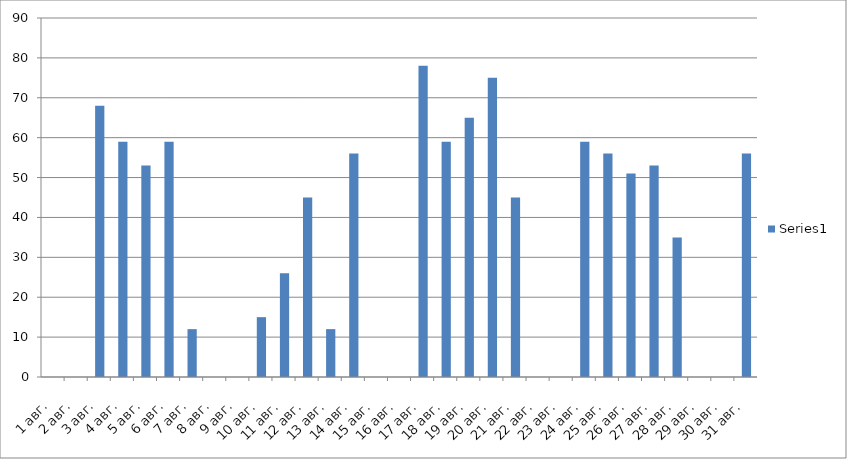
| Category | Series 0 |
|---|---|
| 2020-08-01 | 0 |
| 2020-08-02 | 0 |
| 2020-08-03 | 68 |
| 2020-08-04 | 59 |
| 2020-08-05 | 53 |
| 2020-08-06 | 59 |
| 2020-08-07 | 12 |
| 2020-08-08 | 0 |
| 2020-08-09 | 0 |
| 2020-08-10 | 15 |
| 2020-08-11 | 26 |
| 2020-08-12 | 45 |
| 2020-08-13 | 12 |
| 2020-08-14 | 56 |
| 2020-08-15 | 0 |
| 2020-08-16 | 0 |
| 2020-08-17 | 78 |
| 2020-08-18 | 59 |
| 2020-08-19 | 65 |
| 2020-08-20 | 75 |
| 2020-08-21 | 45 |
| 2020-08-22 | 0 |
| 2020-08-23 | 0 |
| 2020-08-24 | 59 |
| 2020-08-25 | 56 |
| 2020-08-26 | 51 |
| 2020-08-27 | 53 |
| 2020-08-28 | 35 |
| 2020-08-29 | 0 |
| 2020-08-30 | 0 |
| 2020-08-31 | 56 |